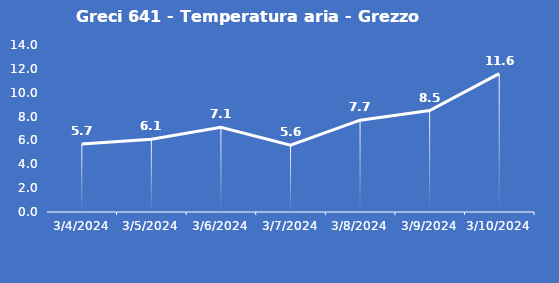
| Category | Greci 641 - Temperatura aria - Grezzo (°C) |
|---|---|
| 3/4/24 | 5.7 |
| 3/5/24 | 6.1 |
| 3/6/24 | 7.1 |
| 3/7/24 | 5.6 |
| 3/8/24 | 7.7 |
| 3/9/24 | 8.5 |
| 3/10/24 | 11.6 |